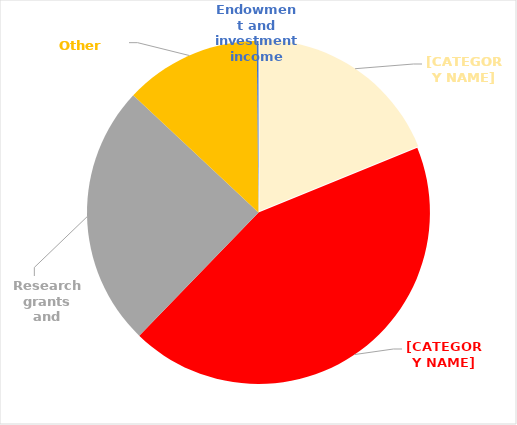
| Category | Series 0 |
|---|---|
| Funding body grants | 70943 |
| Tuition fees and education contracts | 163555 |
| Research grants and contracts | 93162 |
| Other income | 48478 |
| Endowment and investment income | 623 |